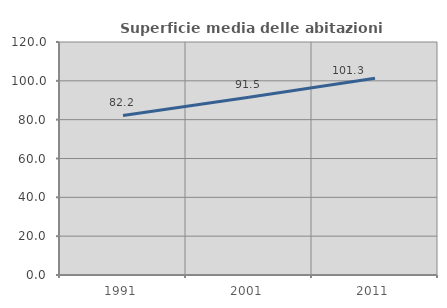
| Category | Superficie media delle abitazioni occupate |
|---|---|
| 1991.0 | 82.198 |
| 2001.0 | 91.518 |
| 2011.0 | 101.326 |